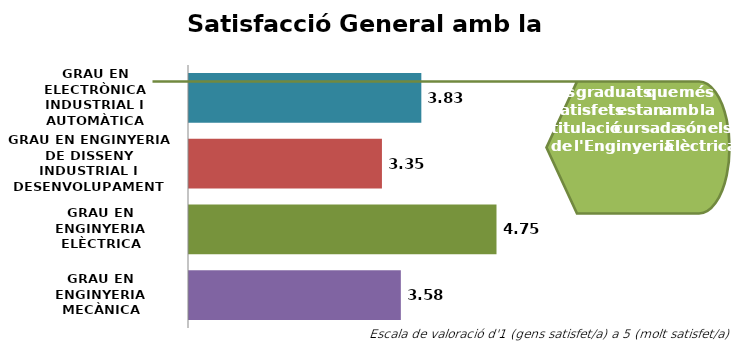
| Category | Series 1 |
|---|---|
| GRAU EN ELECTRÒNICA INDUSTRIAL I AUTOMÀTICA | 3.833 |
| GRAU EN ENGINYERIA DE DISSENY INDUSTRIAL I DESENVOLUPAMENT DEL PRODUCTE | 3.353 |
| GRAU EN ENGINYERIA ELÈCTRICA | 4.75 |
| GRAU EN ENGINYERIA MECÀNICA | 3.583 |